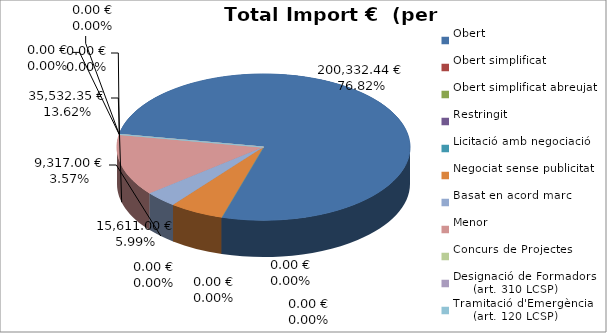
| Category | Total preu
(amb IVA) |
|---|---|
| Obert | 200332.44 |
| Obert simplificat | 0 |
| Obert simplificat abreujat | 0 |
| Restringit | 0 |
| Licitació amb negociació | 0 |
| Negociat sense publicitat | 15610.996 |
| Basat en acord marc | 9317 |
| Menor | 35532.349 |
| Concurs de Projectes | 0 |
| Designació de Formadors
     (art. 310 LCSP) | 0 |
| Tramitació d'Emergència
     (art. 120 LCSP) | 0 |